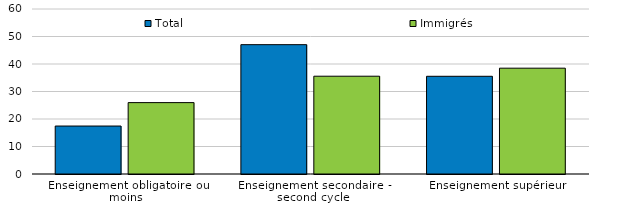
| Category | Total | Immigrés |
|---|---|---|
| Enseignement obligatoire ou moins | 17.44 | 25.96 |
| Enseignement secondaire - second cycle | 47.03 | 35.56 |
| Enseignement supérieur | 35.53 | 38.48 |